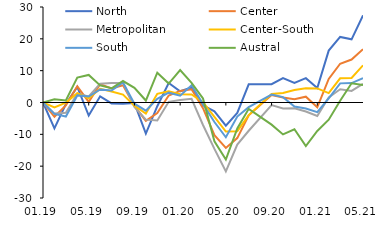
| Category | North | Center | Metropolitan | Center-South | South | Austral |
|---|---|---|---|---|---|---|
| 2019-01-01 | 0 | 0 | 0 | 0 | 0 | 0 |
| 2019-02-01 | -8.114 | -4.499 | -3.49 | -1.527 | -3.595 | 1.034 |
| 2019-03-01 | -0.472 | -0.903 | -3.247 | -0.036 | -4.406 | 0.629 |
| 2019-04-01 | 4.899 | 5.079 | 2.767 | 2.922 | 2.225 | 7.854 |
| 2019-05-01 | -4.104 | 0.197 | 1.909 | 1.309 | 1.865 | 8.657 |
| 2019-06-01 | 1.931 | 5.749 | 5.918 | 4.3 | 4.086 | 5.372 |
| 2019-07-01 | -0.282 | 4.445 | 6.106 | 3.458 | 3.75 | 4.475 |
| 2019-08-01 | -0.367 | 5.387 | 6.157 | 2.47 | 6.306 | 6.746 |
| 2019-09-01 | -0.167 | -1.053 | -1.365 | -0.995 | -0.374 | 4.593 |
| 2019-10-01 | -9.749 | -5.777 | -5.363 | -3.446 | -2.572 | 0.618 |
| 2019-11-01 | -1.161 | -3.333 | -5.646 | 2.716 | 1.171 | 9.367 |
| 2019-12-01 | 6.107 | 2.213 | 0.211 | 3.526 | 3.087 | 5.943 |
| 2020-01-01 | 3.52 | 3.633 | 0.75 | 2.628 | 2.153 | 10.165 |
| 2020-02-01 | 4.707 | 4.164 | 1.183 | 2.525 | 5.425 | 6.16 |
| 2020-03-01 | -0.867 | -1.797 | -7.056 | 0.119 | -0.502 | 1.261 |
| 2020-04-01 | -2.778 | -10.284 | -14.577 | -4.493 | -6.139 | -12.214 |
| 2020-05-01 | -7.263 | -14.263 | -21.651 | -9.138 | -10.918 | -17.928 |
| 2020-06-01 | -3.252 | -11.186 | -13.239 | -9.001 | -4.413 | -8.145 |
| 2020-07-01 | 5.696 | -4.02 | -8.881 | -3.957 | -1.471 | -1.991 |
| 2020-09-01 | 5.771 | 2.341 | -0.796 | 2.698 | 2.47 | -6.962 |
| 2020-10-01 | 7.688 | 1.545 | -1.895 | 2.986 | 1.684 | -10.033 |
| 2020-11-01 | 6.169 | 1.018 | -1.833 | 3.911 | -1.277 | -8.413 |
| 2020-12-01 | 7.646 | 1.821 | -2.826 | 4.462 | -1.912 | -13.696 |
| 2021-01-01 | 4.549 | -1.499 | -4.221 | 4.423 | -3.029 | -8.928 |
| 2021-02-01 | 16.307 | 7.4 | 1.626 | 2.943 | 1.331 | -5.411 |
| 2021-03-01 | 20.595 | 12.177 | 4.174 | 7.59 | 6.009 | 0.574 |
| 2021-04-01 | 19.841 | 13.489 | 3.636 | 7.693 | 6.102 | 6.038 |
| 2021-05-01 | 27.376 | 16.751 | 5.898 | 11.664 | 7.681 | 5.467 |